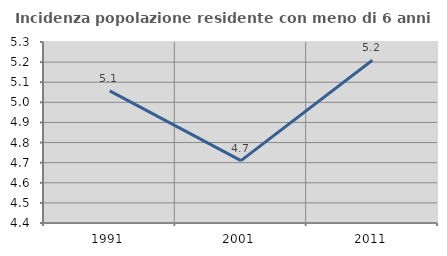
| Category | Incidenza popolazione residente con meno di 6 anni |
|---|---|
| 1991.0 | 5.057 |
| 2001.0 | 4.71 |
| 2011.0 | 5.209 |